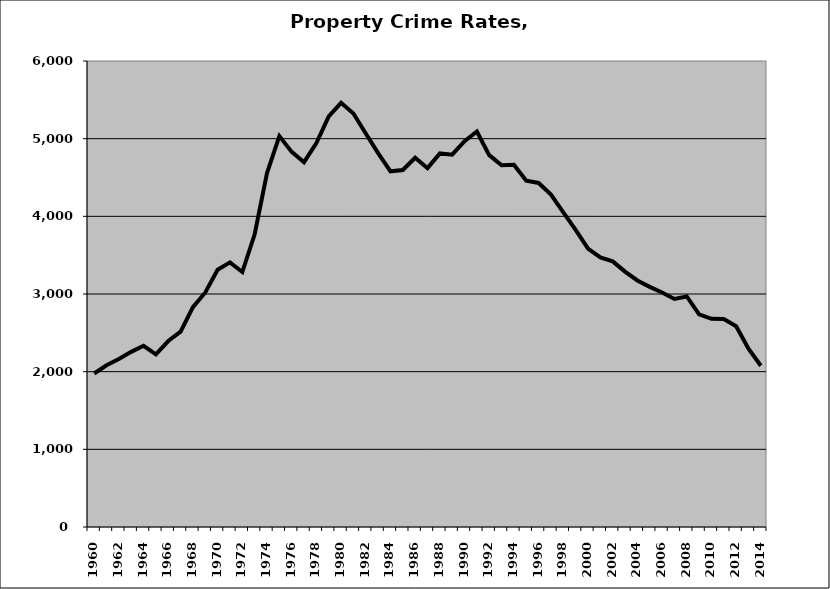
| Category | Property |
|---|---|
| 1960.0 | 1976.787 |
| 1961.0 | 2082.297 |
| 1962.0 | 2162.36 |
| 1963.0 | 2255.009 |
| 1964.0 | 2333.435 |
| 1965.0 | 2223.206 |
| 1966.0 | 2394.432 |
| 1967.0 | 2516.194 |
| 1968.0 | 2829.834 |
| 1969.0 | 3019.987 |
| 1970.0 | 3311.641 |
| 1971.0 | 3408.065 |
| 1972.0 | 3283.059 |
| 1973.0 | 3769.064 |
| 1974.0 | 4557.129 |
| 1975.0 | 5033.244 |
| 1976.0 | 4829.468 |
| 1977.0 | 4697.119 |
| 1978.0 | 4943.102 |
| 1979.0 | 5287.177 |
| 1980.0 | 5461.062 |
| 1981.0 | 5323.151 |
| 1982.0 | 5065.985 |
| 1983.0 | 4813.312 |
| 1984.0 | 4579.307 |
| 1985.0 | 4596.489 |
| 1986.0 | 4754.279 |
| 1987.0 | 4620.325 |
| 1988.0 | 4810.43 |
| 1989.0 | 4793.301 |
| 1990.0 | 4967.726 |
| 1991.0 | 5092.853 |
| 1992.0 | 4788.066 |
| 1993.0 | 4658.194 |
| 1994.0 | 4664.925 |
| 1995.0 | 4459.611 |
| 1996.0 | 4429.619 |
| 1997.0 | 4279.699 |
| 1998.0 | 4050.768 |
| 1999.0 | 3825.238 |
| 2000.0 | 3585.373 |
| 2001.0 | 3471.566 |
| 2002.0 | 3420.179 |
| 2003.0 | 3287.866 |
| 2004.0 | 3174.052 |
| 2005.0 | 3091.71 |
| 2006.0 | 3019.63 |
| 2007.0 | 2935.776 |
| 2008.0 | 2968.53 |
| 2009.0 | 2736.916 |
| 2010.0 | 2680.998 |
| 2011.0 | 2678.652 |
| 2012.0 | 2585.491 |
| 2013.0 | 2296.628 |
| 2014.0 | 2075.877 |